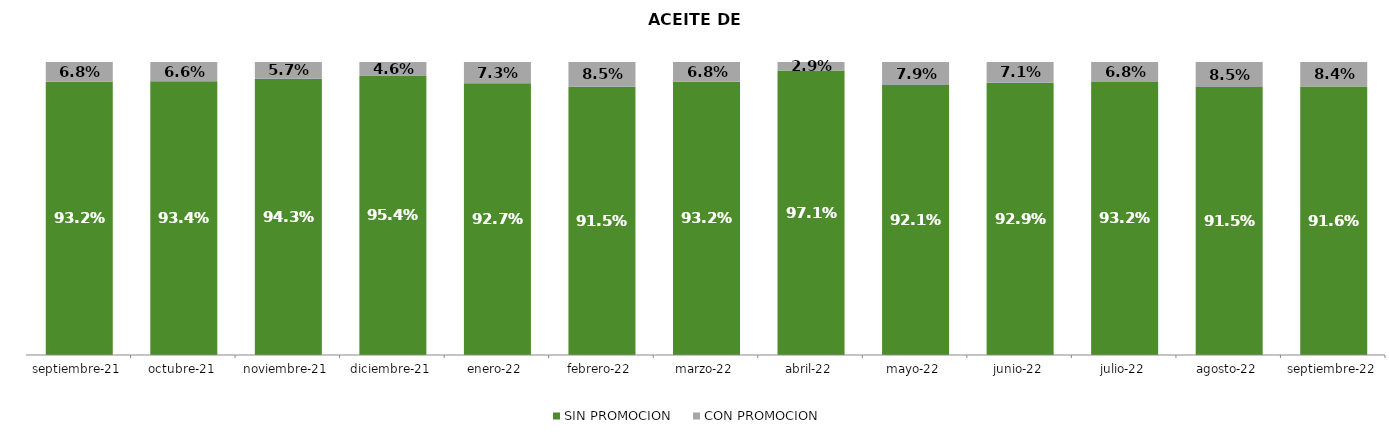
| Category | SIN PROMOCION   | CON PROMOCION   |
|---|---|---|
| 2021-09-01 | 0.932 | 0.068 |
| 2021-10-01 | 0.934 | 0.066 |
| 2021-11-01 | 0.943 | 0.057 |
| 2021-12-01 | 0.954 | 0.046 |
| 2022-01-01 | 0.927 | 0.073 |
| 2022-02-01 | 0.915 | 0.085 |
| 2022-03-01 | 0.932 | 0.068 |
| 2022-04-01 | 0.971 | 0.029 |
| 2022-05-01 | 0.921 | 0.079 |
| 2022-06-01 | 0.929 | 0.071 |
| 2022-07-01 | 0.932 | 0.068 |
| 2022-08-01 | 0.915 | 0.085 |
| 2022-09-01 | 0.916 | 0.084 |